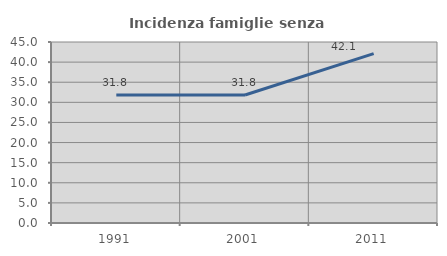
| Category | Incidenza famiglie senza nuclei |
|---|---|
| 1991.0 | 31.847 |
| 2001.0 | 31.829 |
| 2011.0 | 42.097 |